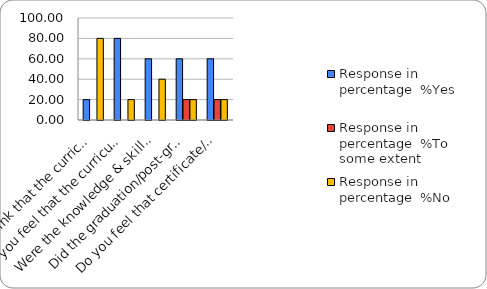
| Category | Response in percentage  |
|---|---|
| Do you think that the curriculum which you had during your graduation/post graduation has provided you with the knowledge & skills necessary to get employed/Self-employed or start own business? | 80 |
| Do you feel that the curriculum you studied is helpful in progression to higher studies? | 20 |
| Were the knowledge & skills acquired through the curriculum useful to you while working on the job?   | 40 |
| Did the graduation/post-graduation programme bring about any attitudinal and behavioural change in you? | 20 |
| Do you feel that certificate/ diploma courses offered by the college in addition to the curriculum lead to better career prospects? | 20 |